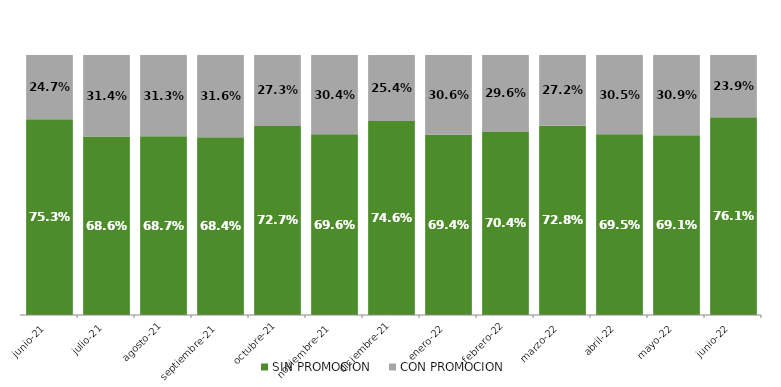
| Category | SIN PROMOCION   | CON PROMOCION   |
|---|---|---|
| 2021-06-01 | 0.753 | 0.247 |
| 2021-07-01 | 0.686 | 0.314 |
| 2021-08-01 | 0.687 | 0.313 |
| 2021-09-01 | 0.684 | 0.316 |
| 2021-10-01 | 0.727 | 0.273 |
| 2021-11-01 | 0.696 | 0.304 |
| 2021-12-01 | 0.746 | 0.254 |
| 2022-01-01 | 0.694 | 0.306 |
| 2022-02-01 | 0.704 | 0.296 |
| 2022-03-01 | 0.728 | 0.272 |
| 2022-04-01 | 0.695 | 0.305 |
| 2022-05-01 | 0.691 | 0.309 |
| 2022-06-01 | 0.761 | 0.239 |